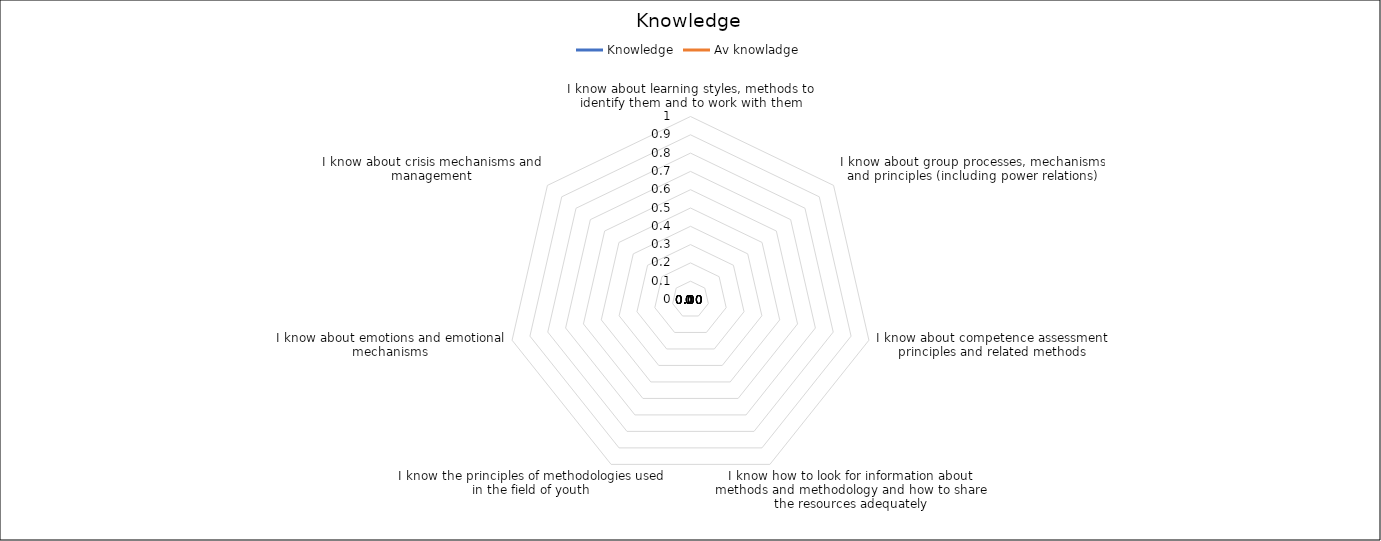
| Category | Knowledge | Av knowladge |
|---|---|---|
| I know about learning styles, methods to identify them and to work with them | 0 | 0 |
| I know about group processes, mechanisms and principles (including power relations) | 0 | 0 |
| I know about competence assessment principles and related methods | 0 | 0 |
| I know how to look for information about methods and methodology and how to share the resources adequately | 0 | 0 |
| I know the principles of methodologies used in the field of youth | 0 | 0 |
| I know about emotions and emotional mechanisms | 0 | 0 |
| I know about crisis mechanisms and management | 0 | 0 |